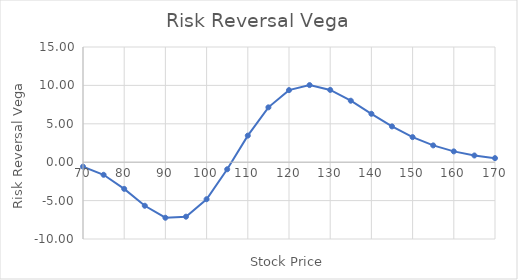
| Category | Vega |
|---|---|
| 55.0 | -0.002 |
| 60.0 | -0.024 |
| 65.0 | -0.144 |
| 70.0 | -0.577 |
| 75.0 | -1.64 |
| 80.0 | -3.475 |
| 85.0 | -5.671 |
| 90.0 | -7.231 |
| 95.0 | -7.092 |
| 100.0 | -4.821 |
| 105.0 | -0.922 |
| 110.0 | 3.461 |
| 115.0 | 7.143 |
| 120.0 | 9.385 |
| 125.0 | 10.04 |
| 130.0 | 9.412 |
| 135.0 | 8.005 |
| 140.0 | 6.304 |
| 145.0 | 4.66 |
| 150.0 | 3.266 |
| 155.0 | 2.187 |
| 160.0 | 1.408 |
| 165.0 | 0.875 |
| 170.0 | 0.528 |